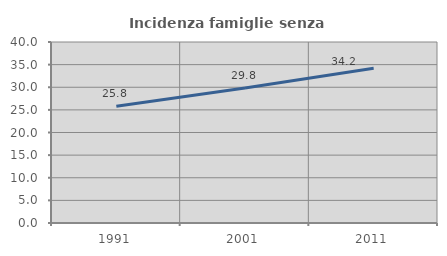
| Category | Incidenza famiglie senza nuclei |
|---|---|
| 1991.0 | 25.809 |
| 2001.0 | 29.844 |
| 2011.0 | 34.187 |